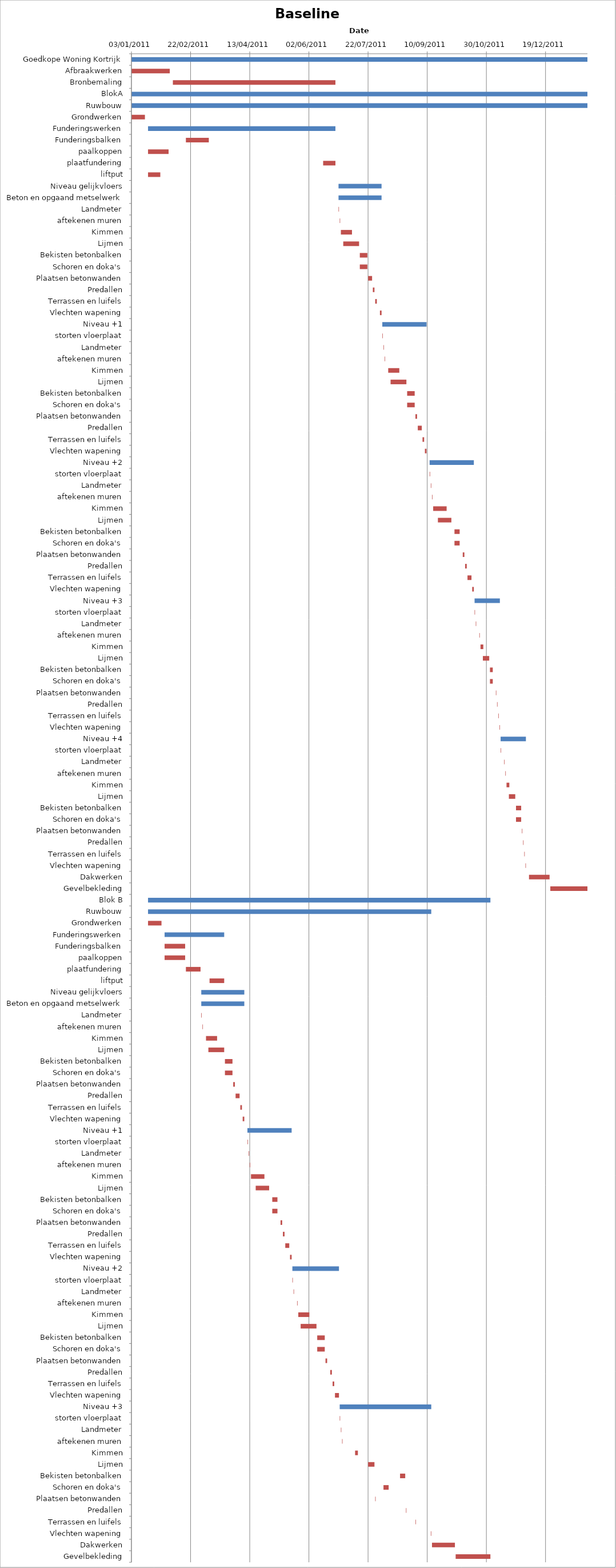
| Category | Baseline start | Actual duration |
|---|---|---|
| Goedkope Woning Kortrijk | 40546.333 | 385.375 |
| Afbraakwerken | 40546.333 | 32.375 |
| Bronbemaling | 40581.333 | 137.375 |
| BlokA | 40546.333 | 385.375 |
| Ruwbouw | 40546.333 | 385.375 |
| Grondwerken | 40546.333 | 11.375 |
| Funderingswerken | 40560.333 | 158.375 |
| Funderingsbalken | 40592.333 | 19.375 |
| paalkoppen | 40560.333 | 17.375 |
| plaatfundering | 40708.333 | 10.375 |
| liftput | 40560.333 | 10.375 |
| Niveau gelijkvloers | 40721.333 | 36.375 |
| Beton en opgaand metselwerk | 40721.333 | 36.375 |
| Landmeter | 40721.333 | 0.375 |
| aftekenen muren | 40722.333 | 0.375 |
| Kimmen | 40723.333 | 9.375 |
| Lijmen | 40725.333 | 13.375 |
| Bekisten betonbalken | 40739.333 | 6.375 |
| Schoren en doka's | 40739.333 | 6.375 |
| Plaatsen betonwanden | 40746.333 | 3.375 |
| Predallen | 40750.333 | 1.375 |
| Terrassen en luifels | 40752.333 | 1.375 |
| Vlechten wapening | 40756.333 | 1.375 |
| Niveau +1 | 40758.333 | 37.375 |
| storten vloerplaat | 40758.333 | 0.375 |
| Landmeter | 40759.333 | 0.375 |
| aftekenen muren | 40760.333 | 0.375 |
| Kimmen | 40763.333 | 9.375 |
| Lijmen | 40765.333 | 13.375 |
| Bekisten betonbalken | 40779.333 | 6.375 |
| Schoren en doka's | 40779.333 | 6.375 |
| Plaatsen betonwanden | 40786.333 | 1.375 |
| Predallen | 40788.333 | 3.375 |
| Terrassen en luifels | 40792.333 | 1.375 |
| Vlechten wapening | 40794.333 | 1.375 |
| Niveau +2 | 40798.333 | 37.375 |
| storten vloerplaat | 40798.333 | 0.375 |
| Landmeter | 40799.333 | 0.375 |
| aftekenen muren | 40800.333 | 0.375 |
| Kimmen | 40801.333 | 11.375 |
| Lijmen | 40805.333 | 11.375 |
| Bekisten betonbalken | 40819.333 | 4.375 |
| Schoren en doka's | 40819.333 | 4.375 |
| Plaatsen betonwanden | 40826.333 | 1.375 |
| Predallen | 40828.333 | 1.375 |
| Terrassen en luifels | 40830.333 | 3.375 |
| Vlechten wapening | 40834.333 | 1.375 |
| Niveau +3 | 40836.333 | 21.375 |
| storten vloerplaat | 40836.333 | 0.375 |
| Landmeter | 40837.333 | 0.375 |
| aftekenen muren | 40840.333 | 0.375 |
| Kimmen | 40841.333 | 2.375 |
| Lijmen | 40843.333 | 5.375 |
| Bekisten betonbalken | 40849.333 | 2.375 |
| Schoren en doka's | 40849.333 | 2.375 |
| Plaatsen betonwanden | 40854.333 | 0.375 |
| Predallen | 40855.333 | 0.375 |
| Terrassen en luifels | 40856.333 | 0.375 |
| Vlechten wapening | 40857.333 | 0.375 |
| Niveau +4 | 40858.333 | 21.375 |
| storten vloerplaat | 40858.333 | 0.375 |
| Landmeter | 40861.333 | 0.375 |
| aftekenen muren | 40862.333 | 0.375 |
| Kimmen | 40863.333 | 2.375 |
| Lijmen | 40865.333 | 5.375 |
| Bekisten betonbalken | 40871.333 | 4.375 |
| Schoren en doka's | 40871.333 | 4.375 |
| Plaatsen betonwanden | 40876.333 | 0.375 |
| Predallen | 40877.333 | 0.375 |
| Terrassen en luifels | 40878.333 | 0.375 |
| Vlechten wapening | 40879.333 | 0.375 |
| Dakwerken | 40882.333 | 17.375 |
| Gevelbekleding | 40900.333 | 31.375 |
| Blok B | 40560.333 | 289.375 |
| Ruwbouw | 40560.333 | 239.375 |
| Grondwerken | 40560.333 | 11.375 |
| Funderingswerken | 40574.333 | 50.375 |
| Funderingsbalken | 40574.333 | 17.375 |
| paalkoppen | 40574.333 | 17.375 |
| plaatfundering | 40592.333 | 12.375 |
| liftput | 40612.333 | 12.375 |
| Niveau gelijkvloers | 40605.333 | 36.375 |
| Beton en opgaand metselwerk | 40605.333 | 36.375 |
| Landmeter | 40605.333 | 0.375 |
| aftekenen muren | 40606.333 | 0.375 |
| Kimmen | 40609.333 | 9.375 |
| Lijmen | 40611.333 | 13.375 |
| Bekisten betonbalken | 40625.333 | 6.375 |
| Schoren en doka's | 40625.333 | 6.375 |
| Plaatsen betonwanden | 40632.333 | 1.375 |
| Predallen | 40634.333 | 3.375 |
| Terrassen en luifels | 40638.333 | 1.375 |
| Vlechten wapening | 40640.333 | 1.375 |
| Niveau +1 | 40644.333 | 37.375 |
| storten vloerplaat | 40644.333 | 0.375 |
| Landmeter | 40645.333 | 0.375 |
| aftekenen muren | 40646.333 | 0.375 |
| Kimmen | 40647.333 | 11.375 |
| Lijmen | 40651.333 | 11.375 |
| Bekisten betonbalken | 40665.333 | 4.375 |
| Schoren en doka's | 40665.333 | 4.375 |
| Plaatsen betonwanden | 40672.333 | 1.375 |
| Predallen | 40674.333 | 1.375 |
| Terrassen en luifels | 40676.333 | 3.375 |
| Vlechten wapening | 40680.333 | 1.375 |
| Niveau +2 | 40682.333 | 39.375 |
| storten vloerplaat | 40682.333 | 0.375 |
| Landmeter | 40683.333 | 0.375 |
| aftekenen muren | 40686.333 | 0.375 |
| Kimmen | 40687.333 | 9.375 |
| Lijmen | 40689.333 | 13.375 |
| Bekisten betonbalken | 40703.333 | 6.375 |
| Schoren en doka's | 40703.333 | 6.375 |
| Plaatsen betonwanden | 40710.333 | 1.375 |
| Predallen | 40714.333 | 1.375 |
| Terrassen en luifels | 40716.333 | 1.375 |
| Vlechten wapening | 40718.333 | 3.375 |
| Niveau +3 | 40722.333 | 77.375 |
| storten vloerplaat | 40722.333 | 0.375 |
| Landmeter | 40723.333 | 0.375 |
| aftekenen muren | 40724.333 | 0.375 |
| Kimmen | 40735.333 | 2.375 |
| Lijmen | 40746.333 | 5.375 |
| Bekisten betonbalken | 40773.333 | 4.375 |
| Schoren en doka's | 40759.333 | 4.375 |
| Plaatsen betonwanden | 40752.333 | 0.375 |
| Predallen | 40778.333 | 0.375 |
| Terrassen en luifels | 40786.333 | 0.375 |
| Vlechten wapening | 40799.333 | 0.375 |
| Dakwerken | 40800.333 | 19.375 |
| Gevelbekleding | 40820.333 | 29.375 |